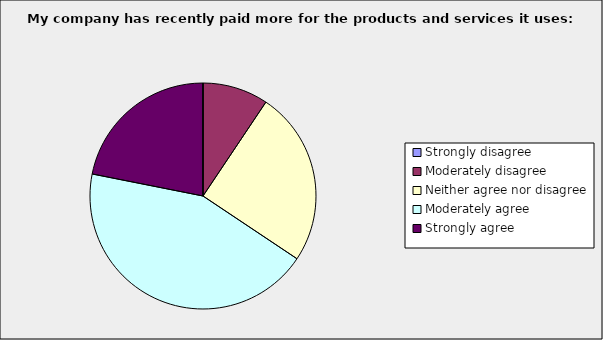
| Category | Series 0 |
|---|---|
| Strongly disagree | 0 |
| Moderately disagree | 0.094 |
| Neither agree nor disagree | 0.25 |
| Moderately agree | 0.438 |
| Strongly agree | 0.219 |